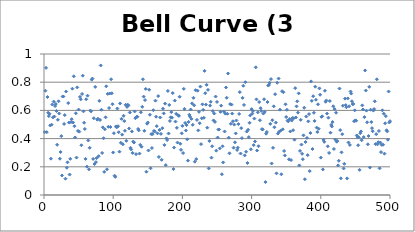
| Category | Bell Curve (3 dice) |
|---|---|
| 0 | 0.446 |
| 1 | 0.74 |
| 2 | 0.902 |
| 3 | 0.445 |
| 4 | 0.695 |
| 5 | 0.583 |
| 6 | 0.559 |
| 7 | 0.576 |
| 8 | 0.493 |
| 9 | 0.258 |
| 10 | 0.499 |
| 11 | 0.642 |
| 12 | 0.551 |
| 13 | 0.663 |
| 14 | 0.557 |
| 15 | 0.631 |
| 16 | 0.645 |
| 17 | 0.596 |
| 18 | 0.356 |
| 19 | 0.533 |
| 20 | 0.665 |
| 21 | 0.578 |
| 22 | 0.257 |
| 23 | 0.305 |
| 24 | 0.418 |
| 25 | 0.139 |
| 26 | 0.698 |
| 27 | 0.699 |
| 28 | 0.504 |
| 29 | 0.567 |
| 30 | 0.116 |
| 31 | 0.734 |
| 32 | 0.193 |
| 33 | 0.232 |
| 34 | 0.652 |
| 35 | 0.514 |
| 36 | 0.145 |
| 37 | 0.257 |
| 38 | 0.517 |
| 39 | 0.538 |
| 40 | 0.754 |
| 41 | 0.514 |
| 42 | 0.842 |
| 43 | 0.488 |
| 44 | 0.408 |
| 45 | 0.58 |
| 46 | 0.265 |
| 47 | 0.763 |
| 48 | 0.455 |
| 49 | 0.606 |
| 50 | 0.449 |
| 51 | 0.696 |
| 52 | 0.678 |
| 53 | 0.353 |
| 54 | 0.717 |
| 55 | 0.846 |
| 56 | 0.593 |
| 57 | 0.513 |
| 58 | 0.468 |
| 59 | 0.256 |
| 60 | 0.679 |
| 61 | 0.201 |
| 62 | 0.705 |
| 63 | 0.387 |
| 64 | 0.182 |
| 65 | 0.335 |
| 66 | 0.599 |
| 67 | 0.593 |
| 68 | 0.818 |
| 69 | 0.826 |
| 70 | 0.256 |
| 71 | 0.545 |
| 72 | 0.219 |
| 73 | 0.767 |
| 74 | 0.233 |
| 75 | 0.262 |
| 76 | 0.534 |
| 77 | 0.541 |
| 78 | 0.275 |
| 79 | 0.668 |
| 80 | 0.532 |
| 81 | 0.919 |
| 82 | 0.605 |
| 83 | 0.298 |
| 84 | 0.48 |
| 85 | 0.402 |
| 86 | 0.164 |
| 87 | 0.467 |
| 88 | 0.551 |
| 89 | 0.771 |
| 90 | 0.182 |
| 91 | 0.717 |
| 92 | 0.484 |
| 93 | 0.617 |
| 94 | 0.72 |
| 95 | 0.482 |
| 96 | 0.821 |
| 97 | 0.721 |
| 98 | 0.644 |
| 99 | 0.302 |
| 100 | 0.438 |
| 101 | 0.137 |
| 102 | 0.129 |
| 103 | 0.487 |
| 104 | 0.48 |
| 105 | 0.613 |
| 106 | 0.488 |
| 107 | 0.445 |
| 108 | 0.307 |
| 109 | 0.649 |
| 110 | 0.37 |
| 111 | 0.54 |
| 112 | 0.428 |
| 113 | 0.36 |
| 114 | 0.562 |
| 115 | 0.524 |
| 116 | 0.455 |
| 117 | 0.64 |
| 118 | 0.384 |
| 119 | 0.625 |
| 120 | 0.641 |
| 121 | 0.635 |
| 122 | 0.472 |
| 123 | 0.585 |
| 124 | 0.335 |
| 125 | 0.323 |
| 126 | 0.451 |
| 127 | 0.299 |
| 128 | 0.379 |
| 129 | 0.372 |
| 130 | 0.593 |
| 131 | 0.545 |
| 132 | 0.29 |
| 133 | 0.555 |
| 134 | 0.555 |
| 135 | 0.469 |
| 136 | 0.459 |
| 137 | 0.294 |
| 138 | 0.355 |
| 139 | 0.587 |
| 140 | 0.342 |
| 141 | 0.625 |
| 142 | 0.821 |
| 143 | 0.698 |
| 144 | 0.455 |
| 145 | 0.673 |
| 146 | 0.752 |
| 147 | 0.165 |
| 148 | 0.506 |
| 149 | 0.514 |
| 150 | 0.316 |
| 151 | 0.747 |
| 152 | 0.569 |
| 153 | 0.189 |
| 154 | 0.432 |
| 155 | 0.333 |
| 156 | 0.432 |
| 157 | 0.601 |
| 158 | 0.455 |
| 159 | 0.45 |
| 160 | 0.669 |
| 161 | 0.555 |
| 162 | 0.488 |
| 163 | 0.437 |
| 164 | 0.702 |
| 165 | 0.27 |
| 166 | 0.461 |
| 167 | 0.55 |
| 168 | 0.433 |
| 169 | 0.249 |
| 170 | 0.474 |
| 171 | 0.612 |
| 172 | 0.579 |
| 173 | 0.355 |
| 174 | 0.648 |
| 175 | 0.212 |
| 176 | 0.401 |
| 177 | 0.39 |
| 178 | 0.738 |
| 179 | 0.436 |
| 180 | 0.639 |
| 181 | 0.525 |
| 182 | 0.551 |
| 183 | 0.588 |
| 184 | 0.548 |
| 185 | 0.723 |
| 186 | 0.184 |
| 187 | 0.336 |
| 188 | 0.67 |
| 189 | 0.521 |
| 190 | 0.576 |
| 191 | 0.476 |
| 192 | 0.372 |
| 193 | 0.565 |
| 194 | 0.561 |
| 195 | 0.697 |
| 196 | 0.364 |
| 197 | 0.32 |
| 198 | 0.437 |
| 199 | 0.49 |
| 200 | 0.297 |
| 201 | 0.753 |
| 202 | 0.611 |
| 203 | 0.511 |
| 204 | 0.457 |
| 205 | 0.496 |
| 206 | 0.395 |
| 207 | 0.244 |
| 208 | 0.518 |
| 209 | 0.569 |
| 210 | 0.556 |
| 211 | 0.606 |
| 212 | 0.54 |
| 213 | 0.65 |
| 214 | 0.498 |
| 215 | 0.689 |
| 216 | 0.636 |
| 217 | 0.236 |
| 218 | 0.743 |
| 219 | 0.255 |
| 220 | 0.533 |
| 221 | 0.74 |
| 222 | 0.458 |
| 223 | 0.59 |
| 224 | 0.509 |
| 225 | 0.769 |
| 226 | 0.361 |
| 227 | 0.544 |
| 228 | 0.643 |
| 229 | 0.604 |
| 230 | 0.547 |
| 231 | 0.88 |
| 232 | 0.722 |
| 233 | 0.641 |
| 234 | 0.781 |
| 235 | 0.477 |
| 236 | 0.746 |
| 237 | 0.188 |
| 238 | 0.383 |
| 239 | 0.634 |
| 240 | 0.661 |
| 241 | 0.265 |
| 242 | 0.346 |
| 243 | 0.595 |
| 244 | 0.529 |
| 245 | 0.578 |
| 246 | 0.518 |
| 247 | 0.698 |
| 248 | 0.314 |
| 249 | 0.66 |
| 250 | 0.407 |
| 251 | 0.464 |
| 252 | 0.465 |
| 253 | 0.33 |
| 254 | 0.59 |
| 255 | 0.634 |
| 256 | 0.147 |
| 257 | 0.346 |
| 258 | 0.231 |
| 259 | 0.591 |
| 260 | 0.451 |
| 261 | 0.577 |
| 262 | 0.763 |
| 263 | 0.69 |
| 264 | 0.576 |
| 265 | 0.862 |
| 266 | 0.407 |
| 267 | 0.296 |
| 268 | 0.645 |
| 269 | 0.505 |
| 270 | 0.641 |
| 271 | 0.578 |
| 272 | 0.523 |
| 273 | 0.335 |
| 274 | 0.499 |
| 275 | 0.374 |
| 276 | 0.437 |
| 277 | 0.528 |
| 278 | 0.319 |
| 279 | 0.336 |
| 280 | 0.503 |
| 281 | 0.575 |
| 282 | 0.73 |
| 283 | 0.294 |
| 284 | 0.474 |
| 285 | 0.403 |
| 286 | 0.689 |
| 287 | 0.775 |
| 288 | 0.638 |
| 289 | 0.281 |
| 290 | 0.8 |
| 291 | 0.307 |
| 292 | 0.45 |
| 293 | 0.227 |
| 294 | 0.463 |
| 295 | 0.41 |
| 296 | 0.512 |
| 297 | 0.564 |
| 298 | 0.324 |
| 299 | 0.609 |
| 300 | 0.577 |
| 301 | 0.596 |
| 302 | 0.354 |
| 303 | 0.542 |
| 304 | 0.38 |
| 305 | 0.906 |
| 306 | 0.679 |
| 307 | 0.315 |
| 308 | 0.586 |
| 309 | 0.346 |
| 310 | 0.659 |
| 311 | 0.53 |
| 312 | 0.616 |
| 313 | 0.596 |
| 314 | 0.467 |
| 315 | 0.465 |
| 316 | 0.578 |
| 317 | 0.679 |
| 318 | 0.589 |
| 319 | 0.092 |
| 320 | 0.435 |
| 321 | 0.447 |
| 322 | 0.66 |
| 323 | 0.777 |
| 324 | 0.781 |
| 325 | 0.796 |
| 326 | 0.504 |
| 327 | 0.822 |
| 328 | 0.224 |
| 329 | 0.531 |
| 330 | 0.335 |
| 331 | 0.629 |
| 332 | 0.481 |
| 333 | 0.715 |
| 334 | 0.514 |
| 335 | 0.154 |
| 336 | 0.796 |
| 337 | 0.436 |
| 338 | 0.826 |
| 339 | 0.449 |
| 340 | 0.605 |
| 341 | 0.457 |
| 342 | 0.147 |
| 343 | 0.736 |
| 344 | 0.466 |
| 345 | 0.729 |
| 346 | 0.312 |
| 347 | 0.28 |
| 348 | 0.643 |
| 349 | 0.553 |
| 350 | 0.604 |
| 351 | 0.528 |
| 352 | 0.522 |
| 353 | 0.253 |
| 354 | 0.539 |
| 355 | 0.451 |
| 356 | 0.248 |
| 357 | 0.528 |
| 358 | 0.546 |
| 359 | 0.46 |
| 360 | 0.545 |
| 361 | 0.392 |
| 362 | 0.758 |
| 363 | 0.55 |
| 364 | 0.629 |
| 365 | 0.664 |
| 366 | 0.584 |
| 367 | 0.721 |
| 368 | 0.21 |
| 369 | 0.313 |
| 370 | 0.533 |
| 371 | 0.358 |
| 372 | 0.292 |
| 373 | 0.254 |
| 374 | 0.423 |
| 375 | 0.619 |
| 376 | 0.112 |
| 377 | 0.376 |
| 378 | 0.557 |
| 379 | 0.405 |
| 380 | 0.283 |
| 381 | 0.522 |
| 382 | 0.574 |
| 383 | 0.17 |
| 384 | 0.44 |
| 385 | 0.806 |
| 386 | 0.668 |
| 387 | 0.326 |
| 388 | 0.701 |
| 389 | 0.583 |
| 390 | 0.525 |
| 391 | 0.768 |
| 392 | 0.675 |
| 393 | 0.478 |
| 394 | 0.447 |
| 395 | 0.643 |
| 396 | 0.47 |
| 397 | 0.756 |
| 398 | 0.711 |
| 399 | 0.265 |
| 400 | 0.554 |
| 401 | 0.558 |
| 402 | 0.182 |
| 403 | 0.391 |
| 404 | 0.377 |
| 405 | 0.739 |
| 406 | 0.661 |
| 407 | 0.67 |
| 408 | 0.577 |
| 409 | 0.345 |
| 410 | 0.548 |
| 411 | 0.298 |
| 412 | 0.666 |
| 413 | 0.442 |
| 414 | 0.497 |
| 415 | 0.486 |
| 416 | 0.517 |
| 417 | 0.629 |
| 418 | 0.326 |
| 419 | 0.609 |
| 420 | 0.393 |
| 421 | 0.583 |
| 422 | 0.378 |
| 423 | 0.382 |
| 424 | 0.21 |
| 425 | 0.243 |
| 426 | 0.755 |
| 427 | 0.46 |
| 428 | 0.118 |
| 429 | 0.303 |
| 430 | 0.431 |
| 431 | 0.633 |
| 432 | 0.188 |
| 433 | 0.221 |
| 434 | 0.683 |
| 435 | 0.638 |
| 436 | 0.623 |
| 437 | 0.118 |
| 438 | 0.685 |
| 439 | 0.373 |
| 440 | 0.629 |
| 441 | 0.355 |
| 442 | 0.734 |
| 443 | 0.719 |
| 444 | 0.665 |
| 445 | 0.644 |
| 446 | 0.646 |
| 447 | 0.523 |
| 448 | 0.601 |
| 449 | 0.529 |
| 450 | 0.526 |
| 451 | 0.422 |
| 452 | 0.412 |
| 453 | 0.353 |
| 454 | 0.409 |
| 455 | 0.178 |
| 456 | 0.438 |
| 457 | 0.451 |
| 458 | 0.388 |
| 459 | 0.636 |
| 460 | 0.607 |
| 461 | 0.411 |
| 462 | 0.552 |
| 463 | 0.883 |
| 464 | 0.741 |
| 465 | 0.599 |
| 466 | 0.516 |
| 467 | 0.36 |
| 468 | 0.418 |
| 469 | 0.767 |
| 470 | 0.195 |
| 471 | 0.605 |
| 472 | 0.517 |
| 473 | 0.474 |
| 474 | 0.452 |
| 475 | 0.599 |
| 476 | 0.61 |
| 477 | 0.664 |
| 478 | 0.361 |
| 479 | 0.432 |
| 480 | 0.821 |
| 481 | 0.359 |
| 482 | 0.374 |
| 483 | 0.454 |
| 484 | 0.189 |
| 485 | 0.372 |
| 486 | 0.304 |
| 487 | 0.356 |
| 488 | 0.6 |
| 489 | 0.357 |
| 490 | 0.577 |
| 491 | 0.293 |
| 492 | 0.508 |
| 493 | 0.559 |
| 494 | 0.459 |
| 495 | 0.451 |
| 496 | 0.392 |
| 497 | 0.734 |
| 498 | 0.514 |
| 499 | 0.523 |